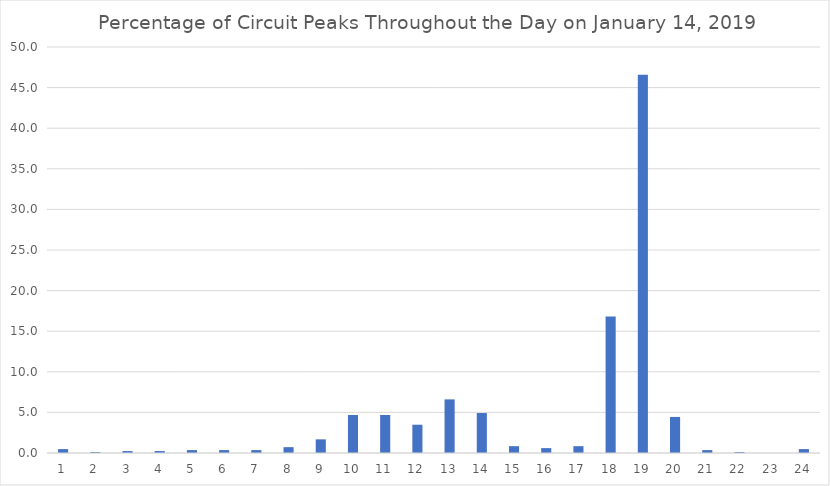
| Category | Series 0 |
|---|---|
| 0 | 0.48 |
| 1 | 0.12 |
| 2 | 0.24 |
| 3 | 0.24 |
| 4 | 0.36 |
| 5 | 0.36 |
| 6 | 0.36 |
| 7 | 0.72 |
| 8 | 1.681 |
| 9 | 4.682 |
| 10 | 4.682 |
| 11 | 3.481 |
| 12 | 6.603 |
| 13 | 4.922 |
| 14 | 0.84 |
| 15 | 0.6 |
| 16 | 0.84 |
| 17 | 16.807 |
| 18 | 46.579 |
| 19 | 4.442 |
| 20 | 0.36 |
| 21 | 0.12 |
| 22 | 0 |
| 23 | 0.48 |